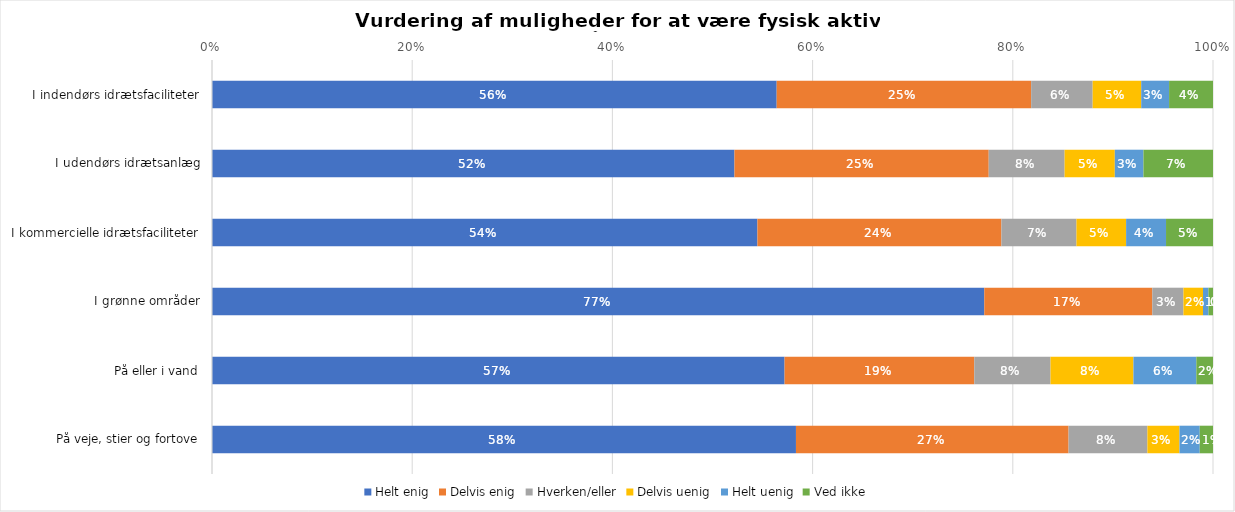
| Category | Helt enig | Delvis enig | Hverken/eller | Delvis uenig | Helt uenig | Ved ikke |
|---|---|---|---|---|---|---|
| I indendørs idrætsfaciliteter | 0.564 | 0.254 | 0.061 | 0.048 | 0.028 | 0.044 |
| I udendørs idrætsanlæg | 0.522 | 0.254 | 0.076 | 0.05 | 0.029 | 0.069 |
| I kommercielle idrætsfaciliteter | 0.545 | 0.244 | 0.075 | 0.05 | 0.04 | 0.047 |
| I grønne områder | 0.772 | 0.168 | 0.031 | 0.02 | 0.005 | 0.005 |
| På eller i vand | 0.572 | 0.19 | 0.076 | 0.083 | 0.063 | 0.017 |
| På veje, stier og fortove | 0.583 | 0.272 | 0.079 | 0.032 | 0.02 | 0.013 |